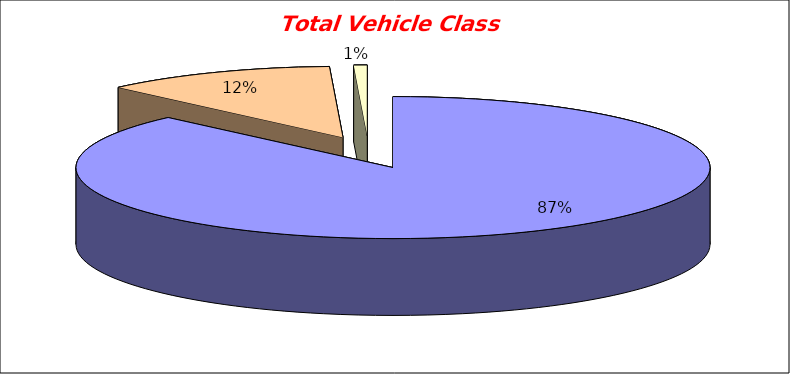
| Category | Series 0 |
|---|---|
| 0 | 1569.714 |
| 1 | 213 |
| 2 | 12.286 |